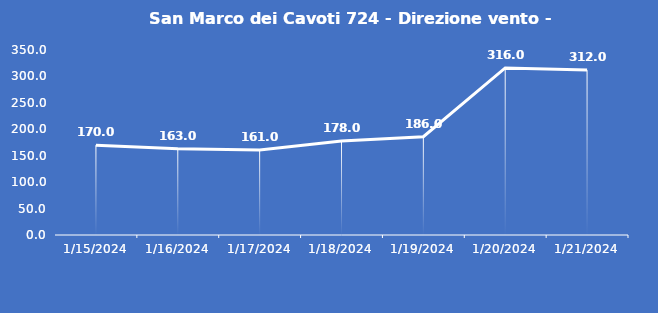
| Category | San Marco dei Cavoti 724 - Direzione vento - Grezzo (°N) |
|---|---|
| 1/15/24 | 170 |
| 1/16/24 | 163 |
| 1/17/24 | 161 |
| 1/18/24 | 178 |
| 1/19/24 | 186 |
| 1/20/24 | 316 |
| 1/21/24 | 312 |